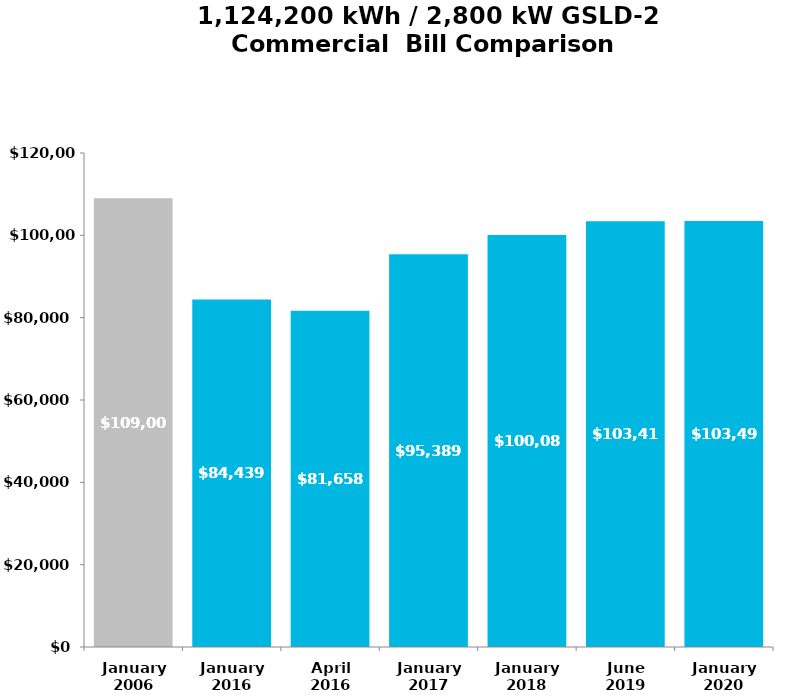
| Category | Total | Series 1 | Series 2 | Series 3 |
|---|---|---|---|---|
| January
2006 | 109007 |  |  |  |
| January
2016 | 84438.58 |  |  |  |
| April
2016 | 81658.48 |  |  |  |
| January
2017 | 95388.51 |  |  |  |
| January
2018 | 100080.93 |  |  |  |
| June
2019 | 103418.19 |  |  |  |
| January
2020 | 103499.34 |  |  |  |